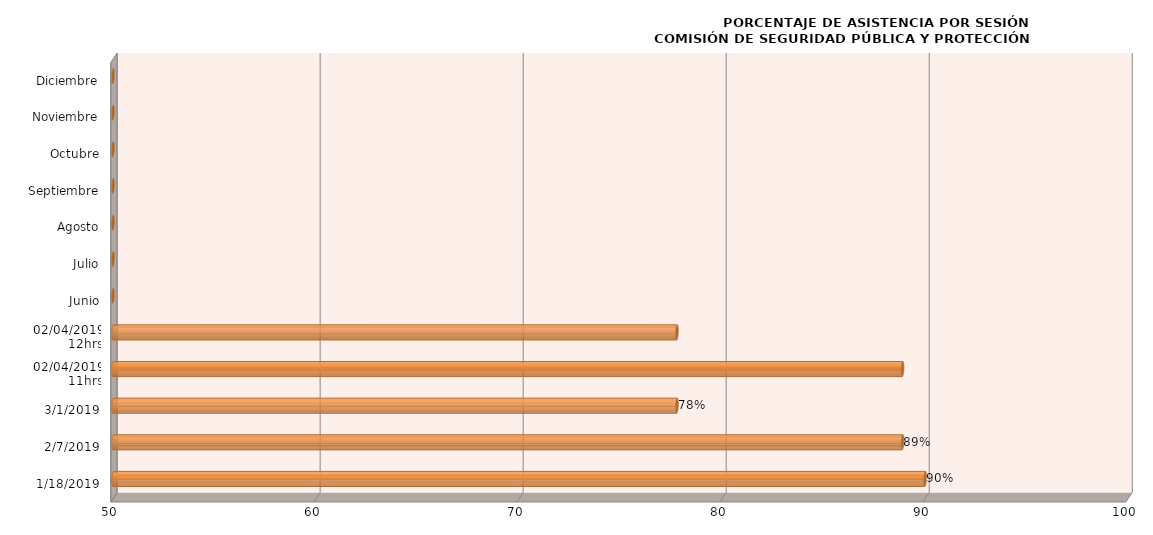
| Category | Series 0 |
|---|---|
| 18/01/2019 | 90 |
| 07/02/2019 | 88.889 |
| 01/03/2019 | 77.778 |
| 02/04/2019
11hrs | 88.889 |
| 02/04/2019
12hrs | 77.778 |
| Junio | 0 |
| Julio | 0 |
| Agosto | 0 |
| Septiembre | 0 |
| Octubre | 0 |
| Noviembre | 0 |
| Diciembre | 0 |